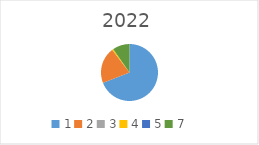
| Category | Series 0 |
|---|---|
| 1.0 | 9901472.7 |
| 2.0 | 2941656.03 |
| 3.0 | 0 |
| 4.0 | 101388.82 |
| 5.0 | 0 |
| 7.0 | 1388141.63 |